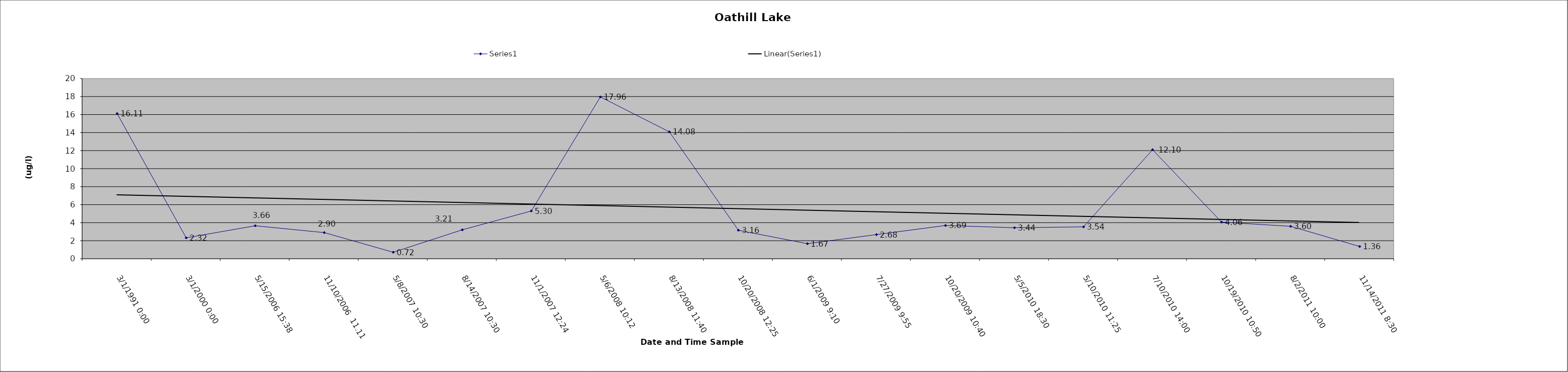
| Category | Series 0 |
|---|---|
| 01/03/1991 0:00 | 16.11 |
| 01/03/2000 0:00 | 2.32 |
| 15/05/2006 15:38 | 3.66 |
| 11/10/2006  11.11  | 2.9 |
| 08/05/2007 10:30 | 0.72 |
| 14/08/2007 10:30 | 3.21 |
| 01/11/2007 12:24 | 5.3 |
| 06/05/2008 10:12 | 17.96 |
| 13/08/2008 11:40 | 14.08 |
| 20/10/2008 12:25 | 3.16 |
| 01/06/2009 9:10 | 1.67 |
| 27/07/2009 9:55 | 2.68 |
| 20/10/2009 10:40 | 3.69 |
| 05/05/2010 18:30 | 3.44 |
| 10/05/2010 11:25 | 3.54 |
| 10/07/2010 14:00 | 12.1 |
| 19/10/2010 10:50 | 4.06 |
| 02/08/2011 10:00 | 3.6 |
| 14/11/2011 8:30 | 1.36 |